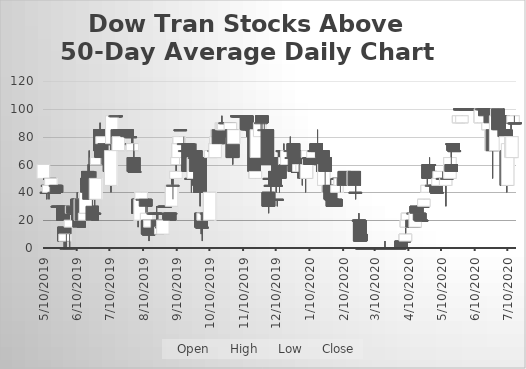
| Category | Open | High | Low | Close |
|---|---|---|---|---|
| 5/10/19 | 50 | 60 | 50 | 60 |
| 5/13/19 | 40 | 50 | 35 | 40 |
| 5/14/19 | 45 | 45 | 40 | 45 |
| 5/15/19 | 40 | 50 | 35 | 45 |
| 5/16/19 | 50 | 50 | 50 | 50 |
| 5/17/19 | 45 | 50 | 45 | 50 |
| 5/20/19 | 40 | 45 | 40 | 40 |
| 5/21/19 | 45 | 45 | 45 | 45 |
| 5/22/19 | 45 | 45 | 40 | 40 |
| 5/23/19 | 30 | 30 | 20 | 30 |
| 5/24/19 | 30 | 30 | 30 | 30 |
| 5/28/19 | 30 | 30 | 20 | 20 |
| 5/29/19 | 15 | 15 | 0.01 | 5 |
| 5/30/19 | 5 | 15 | 0.01 | 10 |
| 5/31/19 | 0.01 | 10 | 0.01 | 0.01 |
| 6/3/19 | 0.01 | 10 | 0.01 | 0.01 |
| 6/4/19 | 15 | 20 | 10 | 20 |
| 6/5/19 | 25 | 30 | 20 | 30 |
| 6/6/19 | 30 | 30 | 15 | 25 |
| 6/7/19 | 25 | 35 | 25 | 25 |
| 6/10/19 | 35 | 40 | 25 | 25 |
| 6/11/19 | 35 | 35 | 20 | 20 |
| 6/12/19 | 20 | 30 | 15 | 15 |
| 6/13/19 | 20 | 35 | 20 | 35 |
| 6/14/19 | 35 | 35 | 20 | 20 |
| 6/17/19 | 20 | 30 | 20 | 25 |
| 6/18/19 | 25 | 55 | 25 | 45 |
| 6/19/19 | 50 | 50 | 35 | 40 |
| 6/20/19 | 55 | 60 | 35 | 45 |
| 6/21/19 | 40 | 70 | 35 | 35 |
| 6/24/19 | 30 | 40 | 20 | 20 |
| 6/25/19 | 25 | 30 | 25 | 25 |
| 6/26/19 | 25 | 35 | 25 | 25 |
| 6/27/19 | 35 | 55 | 35 | 50 |
| 6/28/19 | 60 | 70 | 60 | 65 |
| 7/1/19 | 85 | 90 | 70 | 70 |
| 7/2/19 | 75 | 80 | 60 | 65 |
| 7/3/19 | 75 | 80 | 75 | 80 |
| 7/5/19 | 75 | 75 | 60 | 75 |
| 7/8/19 | 70 | 75 | 65 | 65 |
| 7/9/19 | 65 | 65 | 55 | 60 |
| 7/10/19 | 65 | 65 | 50 | 55 |
| 7/11/19 | 45 | 75 | 40 | 70 |
| 7/12/19 | 75 | 95 | 75 | 95 |
| 7/15/19 | 95 | 95 | 95 | 95 |
| 7/16/19 | 95 | 95 | 95 | 95 |
| 7/17/19 | 85 | 85 | 70 | 75 |
| 7/18/19 | 70 | 80 | 70 | 80 |
| 7/19/19 | 85 | 85 | 85 | 85 |
| 7/22/19 | 85 | 85 | 85 | 85 |
| 7/23/19 | 85 | 85 | 85 | 85 |
| 7/24/19 | 85 | 85 | 85 | 85 |
| 7/25/19 | 85 | 85 | 80 | 85 |
| 7/26/19 | 85 | 85 | 80 | 80 |
| 7/29/19 | 80 | 80 | 80 | 80 |
| 7/30/19 | 75 | 80 | 75 | 75 |
| 7/31/19 | 70 | 80 | 70 | 75 |
| 8/1/19 | 65 | 75 | 55 | 55 |
| 8/2/19 | 55 | 60 | 55 | 55 |
| 8/5/19 | 35 | 35 | 15 | 25 |
| 8/6/19 | 35 | 35 | 25 | 25 |
| 8/7/19 | 20 | 35 | 20 | 35 |
| 8/8/19 | 35 | 40 | 35 | 40 |
| 8/9/19 | 35 | 35 | 35 | 35 |
| 8/12/19 | 35 | 35 | 20 | 30 |
| 8/13/19 | 20 | 30 | 20 | 25 |
| 8/14/19 | 20 | 20 | 10 | 10 |
| 8/15/19 | 10 | 10 | 5 | 10 |
| 8/16/19 | 15 | 20 | 15 | 20 |
| 8/19/19 | 25 | 25 | 25 | 25 |
| 8/20/19 | 25 | 25 | 25 | 25 |
| 8/21/19 | 25 | 25 | 25 | 25 |
| 8/22/19 | 25 | 30 | 20 | 25 |
| 8/23/19 | 20 | 25 | 10 | 10 |
| 8/26/19 | 10 | 15 | 10 | 15 |
| 8/27/19 | 15 | 20 | 15 | 15 |
| 8/28/19 | 10 | 25 | 10 | 20 |
| 8/29/19 | 30 | 30 | 30 | 30 |
| 8/30/19 | 30 | 30 | 30 | 30 |
| 9/3/19 | 25 | 25 | 20 | 20 |
| 9/4/19 | 25 | 25 | 20 | 25 |
| 9/5/19 | 30 | 50 | 30 | 45 |
| 9/6/19 | 45 | 55 | 35 | 45 |
| 9/9/19 | 50 | 60 | 50 | 55 |
| 9/10/19 | 60 | 65 | 60 | 65 |
| 9/11/19 | 65 | 75 | 65 | 75 |
| 9/12/19 | 75 | 80 | 75 | 80 |
| 9/13/19 | 85 | 85 | 85 | 85 |
| 9/16/19 | 75 | 80 | 75 | 75 |
| 9/17/19 | 70 | 75 | 70 | 70 |
| 9/18/19 | 60 | 65 | 60 | 65 |
| 9/19/19 | 70 | 70 | 65 | 70 |
| 9/20/19 | 75 | 75 | 55 | 55 |
| 9/23/19 | 50 | 60 | 40 | 50 |
| 9/24/19 | 50 | 75 | 45 | 50 |
| 9/25/19 | 50 | 70 | 50 | 65 |
| 9/26/19 | 65 | 65 | 55 | 65 |
| 9/27/19 | 70 | 75 | 50 | 55 |
| 9/30/19 | 65 | 70 | 65 | 65 |
| 10/1/19 | 65 | 70 | 30 | 40 |
| 10/2/19 | 25 | 25 | 10 | 15 |
| 10/3/19 | 15 | 20 | 5 | 15 |
| 10/4/19 | 20 | 25 | 20 | 25 |
| 10/7/19 | 25 | 25 | 25 | 25 |
| 10/8/19 | 25 | 25 | 20 | 20 |
| 10/9/19 | 25 | 35 | 20 | 25 |
| 10/10/19 | 20 | 40 | 20 | 40 |
| 10/11/19 | 65 | 80 | 65 | 70 |
| 10/14/19 | 70 | 75 | 65 | 70 |
| 10/15/19 | 65 | 85 | 65 | 75 |
| 10/16/19 | 75 | 80 | 75 | 80 |
| 10/17/19 | 80 | 85 | 80 | 85 |
| 10/18/19 | 85 | 85 | 75 | 75 |
| 10/21/19 | 85 | 95 | 85 | 90 |
| 10/22/19 | 85 | 90 | 80 | 90 |
| 10/23/19 | 85 | 90 | 85 | 90 |
| 10/24/19 | 90 | 90 | 85 | 90 |
| 10/25/19 | 90 | 90 | 90 | 90 |
| 10/28/19 | 90 | 90 | 90 | 90 |
| 10/29/19 | 85 | 90 | 85 | 90 |
| 10/30/19 | 85 | 85 | 75 | 80 |
| 10/31/19 | 80 | 80 | 60 | 65 |
| 11/1/19 | 75 | 85 | 75 | 85 |
| 11/4/19 | 95 | 95 | 95 | 95 |
| 11/5/19 | 95 | 95 | 95 | 95 |
| 11/6/19 | 95 | 95 | 95 | 95 |
| 11/7/19 | 95 | 95 | 95 | 95 |
| 11/8/19 | 95 | 95 | 90 | 95 |
| 11/11/19 | 95 | 95 | 90 | 95 |
| 11/12/19 | 95 | 95 | 95 | 95 |
| 11/13/19 | 95 | 95 | 85 | 85 |
| 11/14/19 | 90 | 90 | 80 | 90 |
| 11/15/19 | 90 | 90 | 85 | 85 |
| 11/18/19 | 85 | 85 | 75 | 85 |
| 11/19/19 | 85 | 85 | 80 | 80 |
| 11/20/19 | 80 | 80 | 55 | 55 |
| 11/21/19 | 50 | 60 | 50 | 55 |
| 11/22/19 | 65 | 85 | 60 | 85 |
| 11/25/19 | 80 | 90 | 80 | 90 |
| 11/26/19 | 90 | 90 | 85 | 90 |
| 11/27/19 | 95 | 95 | 85 | 90 |
| 11/29/19 | 85 | 90 | 85 | 85 |
| 12/2/19 | 85 | 85 | 60 | 60 |
| 12/3/19 | 40 | 40 | 25 | 30 |
| 12/4/19 | 50 | 55 | 50 | 50 |
| 12/5/19 | 45 | 45 | 35 | 45 |
| 12/6/19 | 65 | 65 | 55 | 60 |
| 12/9/19 | 55 | 60 | 45 | 45 |
| 12/10/19 | 45 | 55 | 40 | 45 |
| 12/11/19 | 35 | 35 | 30 | 35 |
| 12/12/19 | 55 | 70 | 55 | 55 |
| 12/13/19 | 60 | 70 | 40 | 50 |
| 12/16/19 | 70 | 70 | 65 | 70 |
| 12/17/19 | 70 | 75 | 65 | 70 |
| 12/18/19 | 60 | 65 | 50 | 65 |
| 12/19/19 | 60 | 70 | 50 | 60 |
| 12/20/19 | 60 | 70 | 60 | 70 |
| 12/23/19 | 70 | 80 | 65 | 70 |
| 12/24/19 | 65 | 70 | 60 | 65 |
| 12/26/19 | 75 | 75 | 60 | 65 |
| 12/27/19 | 70 | 70 | 55 | 55 |
| 12/30/19 | 55 | 55 | 50 | 55 |
| 12/31/19 | 55 | 60 | 55 | 60 |
| 1/2/20 | 65 | 65 | 55 | 65 |
| 1/3/20 | 55 | 60 | 45 | 60 |
| 1/6/20 | 60 | 60 | 40 | 50 |
| 1/7/20 | 50 | 65 | 50 | 60 |
| 1/8/20 | 65 | 70 | 65 | 70 |
| 1/9/20 | 65 | 70 | 60 | 65 |
| 1/10/20 | 65 | 70 | 60 | 60 |
| 1/13/20 | 65 | 70 | 65 | 70 |
| 1/14/20 | 70 | 70 | 70 | 70 |
| 1/15/20 | 70 | 70 | 70 | 70 |
| 1/16/20 | 75 | 75 | 70 | 70 |
| 1/17/20 | 70 | 85 | 70 | 70 |
| 1/21/20 | 70 | 70 | 60 | 65 |
| 1/22/20 | 70 | 70 | 55 | 55 |
| 1/23/20 | 45 | 60 | 45 | 60 |
| 1/24/20 | 65 | 65 | 45 | 55 |
| 1/27/20 | 40 | 45 | 40 | 45 |
| 1/28/20 | 45 | 45 | 40 | 40 |
| 1/29/20 | 45 | 50 | 35 | 35 |
| 1/30/20 | 35 | 35 | 30 | 35 |
| 1/31/20 | 35 | 35 | 30 | 30 |
| 2/3/20 | 35 | 35 | 30 | 30 |
| 2/4/20 | 40 | 50 | 40 | 45 |
| 2/5/20 | 50 | 50 | 50 | 50 |
| 2/6/20 | 50 | 50 | 45 | 50 |
| 2/7/20 | 45 | 50 | 40 | 50 |
| 2/10/20 | 50 | 50 | 45 | 45 |
| 2/11/20 | 55 | 55 | 50 | 50 |
| 2/12/20 | 50 | 50 | 50 | 50 |
| 2/13/20 | 50 | 50 | 50 | 50 |
| 2/14/20 | 50 | 55 | 50 | 50 |
| 2/18/20 | 50 | 55 | 50 | 50 |
| 2/19/20 | 45 | 55 | 45 | 55 |
| 2/20/20 | 55 | 55 | 45 | 45 |
| 2/21/20 | 40 | 45 | 35 | 40 |
| 2/24/20 | 20 | 25 | 15 | 20 |
| 2/25/20 | 20 | 20 | 5 | 5 |
| 2/26/20 | 10 | 15 | 5 | 5 |
| 2/27/20 | 0.01 | 0.01 | 0.01 | 0.01 |
| 2/28/20 | 0.01 | 0.01 | 0.01 | 0.01 |
| 3/2/20 | 0.01 | 0.01 | 0.01 | 0.01 |
| 3/3/20 | 0.01 | 0.01 | 0.01 | 0.01 |
| 3/4/20 | 0.01 | 0.01 | 0.01 | 0.01 |
| 3/5/20 | 0.01 | 0.01 | 0.01 | 0.01 |
| 3/6/20 | 0.01 | 0.01 | 0.01 | 0.01 |
| 3/9/20 | 0.01 | 0.01 | 0.01 | 0.01 |
| 3/10/20 | 0.01 | 0.01 | 0.01 | 0.01 |
| 3/11/20 | 0.01 | 0.01 | 0.01 | 0.01 |
| 3/12/20 | 0.01 | 0.01 | 0.01 | 0.01 |
| 3/13/20 | 0.01 | 0.01 | 0.01 | 0.01 |
| 3/16/20 | 0.01 | 0.01 | 0.01 | 0.01 |
| 3/17/20 | 0.01 | 0.01 | 0.01 | 0.01 |
| 3/18/20 | 0.01 | 0.01 | 0.01 | 0.01 |
| 3/19/20 | 0.01 | 5 | 0.01 | 0.01 |
| 3/20/20 | 0.01 | 0.01 | 0.01 | 0.01 |
| 3/23/20 | 0.01 | 0.01 | 0.01 | 0.01 |
| 3/24/20 | 0.01 | 0.01 | 0.01 | 0.01 |
| 3/25/20 | 0.01 | 0.01 | 0.01 | 0.01 |
| 3/26/20 | 0.01 | 0.01 | 0.01 | 0.01 |
| 3/27/20 | 0.01 | 0.01 | 0.01 | 0.01 |
| 3/30/20 | 0.01 | 0.01 | 0.01 | 0.01 |
| 3/31/20 | 0.01 | 0.01 | 0.01 | 0.01 |
| 4/1/20 | 0.01 | 0.01 | 0.01 | 0.01 |
| 4/2/20 | 0.01 | 0.01 | 0.01 | 0.01 |
| 4/3/20 | 5 | 5 | 0.01 | 0.01 |
| 4/6/20 | 5 | 10 | 5 | 5 |
| 4/7/20 | 5 | 15 | 5 | 10 |
| 4/8/20 | 15 | 20 | 15 | 20 |
| 4/9/20 | 20 | 25 | 15 | 25 |
| 4/13/20 | 20 | 20 | 15 | 15 |
| 4/14/20 | 25 | 25 | 15 | 25 |
| 4/15/20 | 20 | 20 | 15 | 15 |
| 4/16/20 | 15 | 25 | 15 | 25 |
| 4/17/20 | 30 | 30 | 25 | 25 |
| 4/20/20 | 25 | 25 | 20 | 20 |
| 4/21/20 | 20 | 20 | 20 | 20 |
| 4/22/20 | 20 | 20 | 20 | 20 |
| 4/23/20 | 30 | 30 | 25 | 30 |
| 4/24/20 | 30 | 35 | 30 | 35 |
| 4/27/20 | 40 | 55 | 40 | 45 |
| 4/28/20 | 60 | 60 | 50 | 50 |
| 4/29/20 | 60 | 65 | 50 | 60 |
| 4/30/20 | 55 | 55 | 50 | 50 |
| 5/1/20 | 45 | 45 | 40 | 45 |
| 5/4/20 | 45 | 45 | 40 | 45 |
| 5/5/20 | 45 | 45 | 40 | 40 |
| 5/6/20 | 40 | 45 | 40 | 40 |
| 5/7/20 | 45 | 50 | 45 | 50 |
| 5/8/20 | 50 | 55 | 50 | 55 |
| 5/11/20 | 50 | 55 | 50 | 50 |
| 5/12/20 | 50 | 50 | 50 | 50 |
| 5/13/20 | 50 | 50 | 45 | 50 |
| 5/14/20 | 45 | 50 | 30 | 50 |
| 5/15/20 | 50 | 50 | 50 | 50 |
| 5/18/20 | 50 | 65 | 50 | 65 |
| 5/19/20 | 60 | 75 | 55 | 55 |
| 5/20/20 | 75 | 75 | 70 | 75 |
| 5/21/20 | 75 | 75 | 70 | 70 |
| 5/22/20 | 70 | 75 | 70 | 70 |
| 5/26/20 | 90 | 95 | 90 | 95 |
| 5/27/20 | 100 | 100 | 100 | 100 |
| 5/28/20 | 100 | 100 | 100 | 100 |
| 5/29/20 | 90 | 95 | 90 | 95 |
| 6/1/20 | 100 | 100 | 100 | 100 |
| 6/2/20 | 100 | 100 | 100 | 100 |
| 6/3/20 | 100 | 100 | 100 | 100 |
| 6/4/20 | 100 | 100 | 100 | 100 |
| 6/5/20 | 100 | 100 | 100 | 100 |
| 6/8/20 | 100 | 100 | 100 | 100 |
| 6/9/20 | 100 | 100 | 100 | 100 |
| 6/10/20 | 100 | 100 | 100 | 100 |
| 6/11/20 | 100 | 100 | 100 | 100 |
| 6/12/20 | 100 | 100 | 90 | 100 |
| 6/15/20 | 90 | 100 | 90 | 100 |
| 6/16/20 | 100 | 100 | 100 | 100 |
| 6/17/20 | 100 | 100 | 100 | 100 |
| 6/18/20 | 100 | 100 | 100 | 100 |
| 6/19/20 | 100 | 100 | 90 | 95 |
| 6/22/20 | 85 | 90 | 80 | 90 |
| 6/23/20 | 100 | 100 | 100 | 100 |
| 6/24/20 | 95 | 95 | 85 | 90 |
| 6/25/20 | 70 | 85 | 70 | 85 |
| 6/26/20 | 85 | 85 | 50 | 70 |
| 6/29/20 | 70 | 95 | 70 | 95 |
| 6/30/20 | 95 | 100 | 95 | 100 |
| 7/1/20 | 100 | 100 | 80 | 85 |
| 7/2/20 | 95 | 95 | 80 | 85 |
| 7/6/20 | 95 | 95 | 85 | 90 |
| 7/7/20 | 85 | 85 | 75 | 80 |
| 7/8/20 | 70 | 80 | 60 | 80 |
| 7/9/20 | 70 | 70 | 40 | 45 |
| 7/10/20 | 45 | 80 | 45 | 75 |
| 7/13/20 | 65 | 90 | 65 | 80 |
| 7/14/20 | 65 | 85 | 65 | 80 |
| 7/15/20 | 90 | 95 | 90 | 95 |
| 7/16/20 | 90 | 95 | 90 | 90 |
| 7/17/20 | 90 | 90 | 90 | 90 |